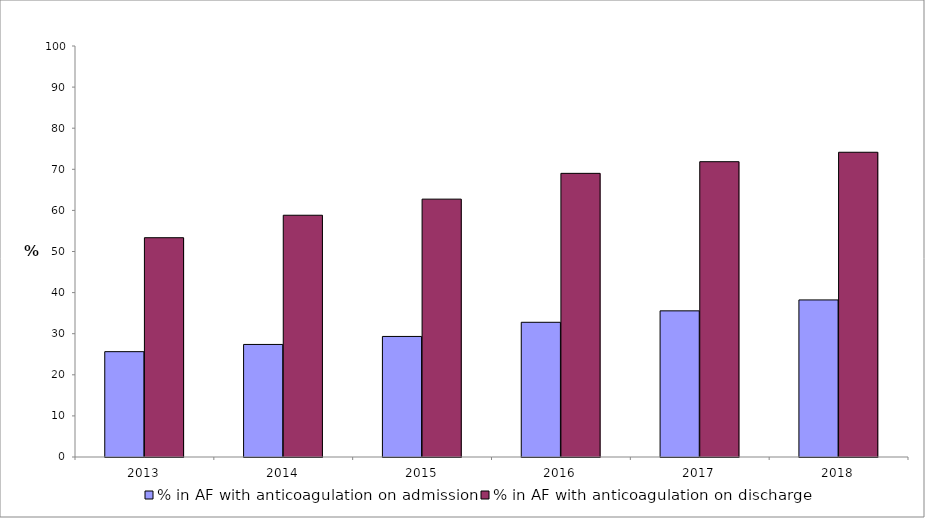
| Category | % in AF with anticoagulation on admission | % in AF with anticoagulation on discharge |
|---|---|---|
| 2013.0 | 25.63 | 53.356 |
| 2014.0 | 27.387 | 58.824 |
| 2015.0 | 29.332 | 62.741 |
| 2016.0 | 32.776 | 69.014 |
| 2017.0 | 35.558 | 71.849 |
| 2018.0 | 38.217 | 74.148 |